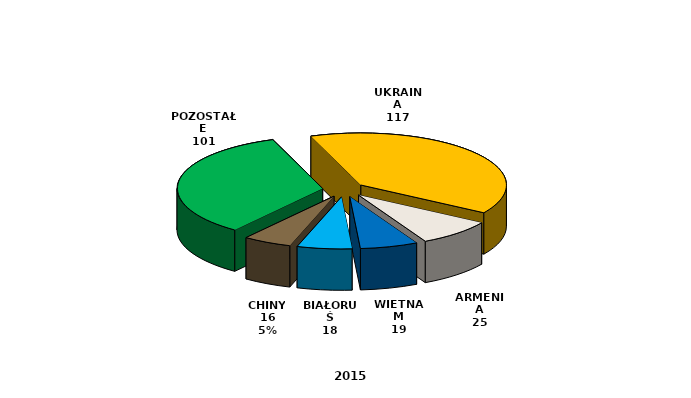
| Category | Series 0 |
|---|---|
| UKRAINA | 117 |
| ARMENIA | 25 |
| WIETNAM | 19 |
| BIAŁORUŚ | 18 |
| CHINY | 16 |
| POZOSTAŁE | 101 |